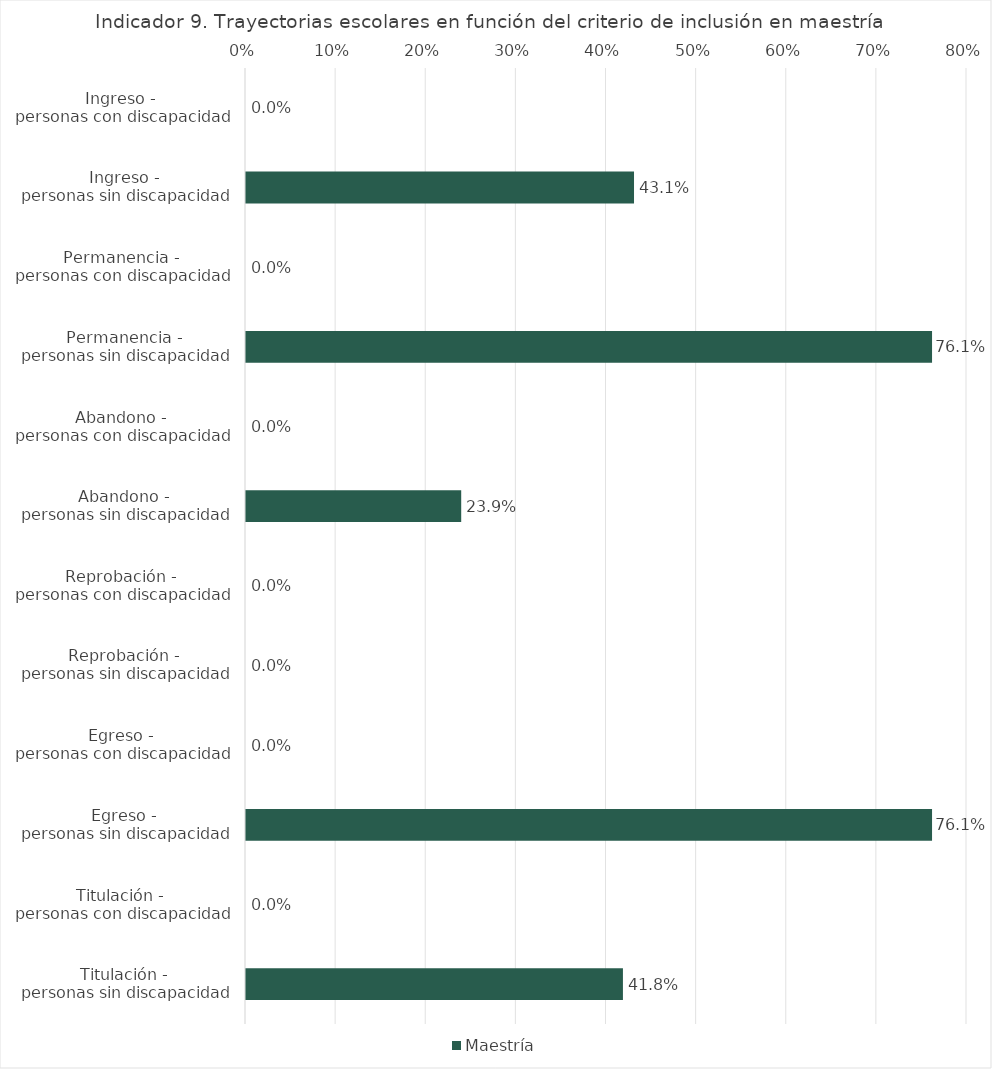
| Category | Maestría |
|---|---|
| Ingreso - 
personas con discapacidad | 0 |
| Ingreso - 
personas sin discapacidad | 0.431 |
| Permanencia - 
personas con discapacidad | 0 |
| Permanencia - 
personas sin discapacidad | 0.761 |
| Abandono - 
personas con discapacidad | 0 |
| Abandono - 
personas sin discapacidad | 0.239 |
| Reprobación - 
personas con discapacidad | 0 |
| Reprobación - 
personas sin discapacidad | 0 |
| Egreso - 
personas con discapacidad | 0 |
| Egreso - 
personas sin discapacidad | 0.761 |
| Titulación - 
personas con discapacidad | 0 |
| Titulación - 
personas sin discapacidad | 0.418 |